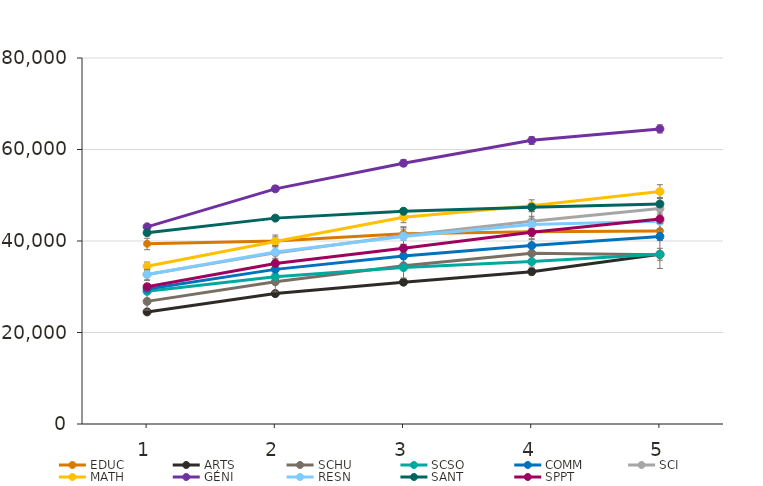
| Category | EDUC | ARTS | SCHU | SCSO | COMM | SCI | MATH | GÉNI | RESN | SANT | SPPT |
|---|---|---|---|---|---|---|---|---|---|---|---|
| 1.0 | 39400 | 24500 | 26800 | 29000 | 29500 | 32700 | 34500 | 43100 | 32700 | 41800 | 30000 |
| 2.0 | 40000 | 28500 | 31100 | 32200 | 33800 | 37400 | 39900 | 51400 | 37600 | 45000 | 35100 |
| 3.0 | 41600 | 31000 | 34600 | 34200 | 36700 | 41200 | 45200 | 57000 | 41000 | 46500 | 38400 |
| 4.0 | 42000 | 33300 | 37300 | 35500 | 39000 | 44300 | 47700 | 62000 | 43600 | 47400 | 41900 |
| 5.0 | 42200 | 37100 | 37000 | 37100 | 41000 | 47100 | 50800 | 64500 | 44300 | 48100 | 44800 |